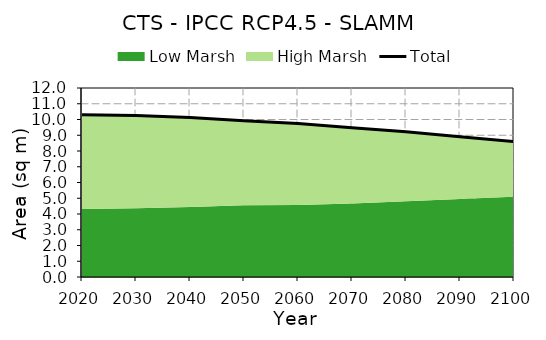
| Category | Total |
|---|---|
| 0 | 10.309 |
| 1 | 10.26 |
| 2 | 10.132 |
| 3 | 9.927 |
| 4 | 9.739 |
| 5 | 9.469 |
| 6 | 9.224 |
| 7 | 8.904 |
| 8 | 8.598 |